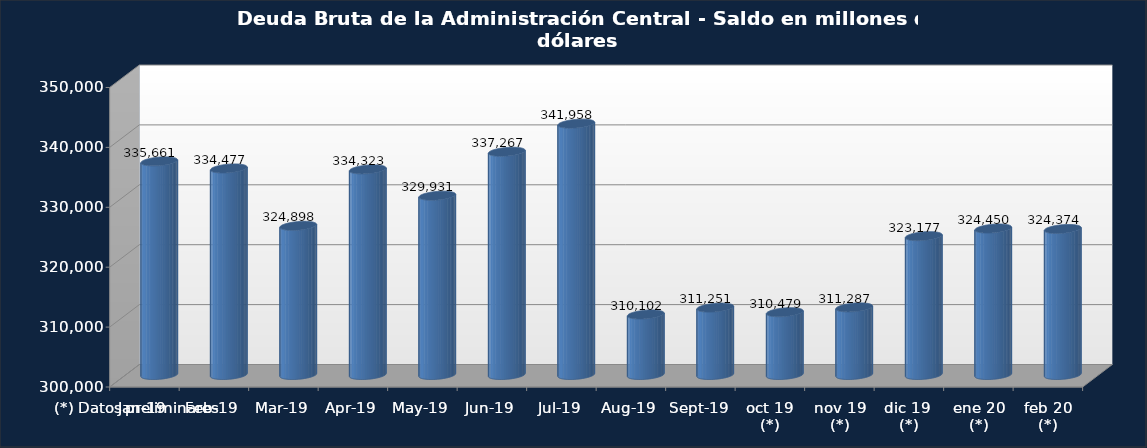
| Category | Series 0 |
|---|---|
| ene-19 | 335661.3 |
| feb-19 | 334477 |
| mar-19 | 324898.3 |
| abr-19 | 334322.9 |
| may-19 | 329930.6 |
| jun-19 | 337267.1 |
| jul-19 | 341957.5 |
| ago-19 | 310102.3 |
| sep-19 | 311251.2 |
| oct 19 (*) | 310478.8 |
| nov 19 (*) | 311286.6 |
| dic 19  (*) | 323176.9 |
| ene 20 (*) | 324449.6 |
| feb 20 (*) | 324374 |